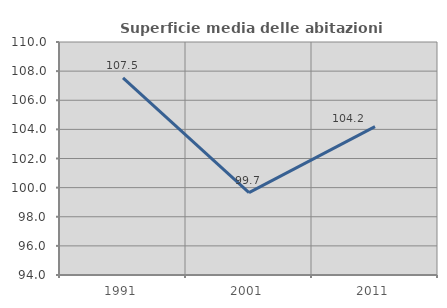
| Category | Superficie media delle abitazioni occupate |
|---|---|
| 1991.0 | 107.537 |
| 2001.0 | 99.66 |
| 2011.0 | 104.193 |